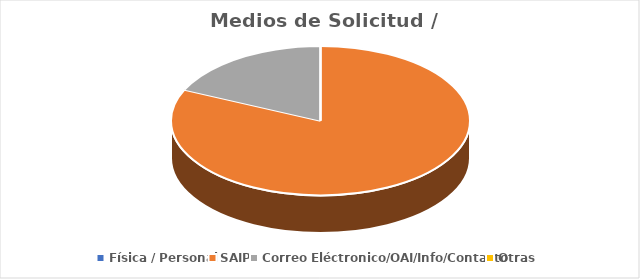
| Category | Series 0 |
|---|---|
| Física / Personal | 0 |
| SAIP | 9 |
| Correo Eléctronico/OAI/Info/Contacto | 2 |
| Otras | 0 |